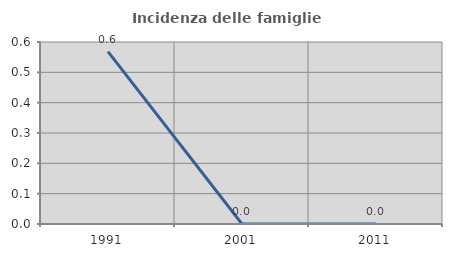
| Category | Incidenza delle famiglie numerose |
|---|---|
| 1991.0 | 0.568 |
| 2001.0 | 0 |
| 2011.0 | 0 |